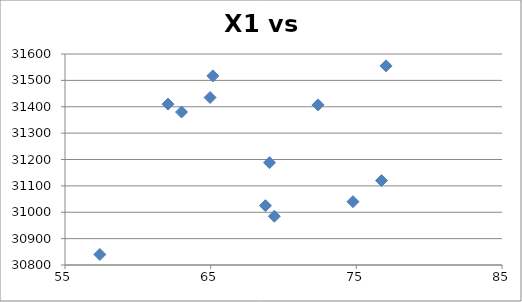
| Category | Series 0 |
|---|---|
| 76.73 | 31120 |
| 57.39 | 30840 |
| 74.77 | 31040 |
| 69.04 | 31188 |
| 65.15 | 31517 |
| 77.04 | 31555 |
| 63.0 | 31380 |
| 64.96 | 31435 |
| 69.37 | 30985 |
| 72.37 | 31407 |
| 62.07 | 31410 |
| 68.76 | 31025 |